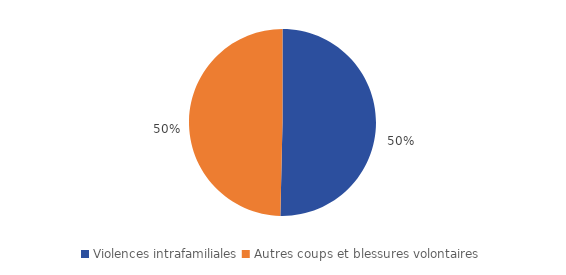
| Category | Series 0 |
|---|---|
| Violences intrafamiliales | 131200 |
| Autres coups et blessures volontaires | 129300 |